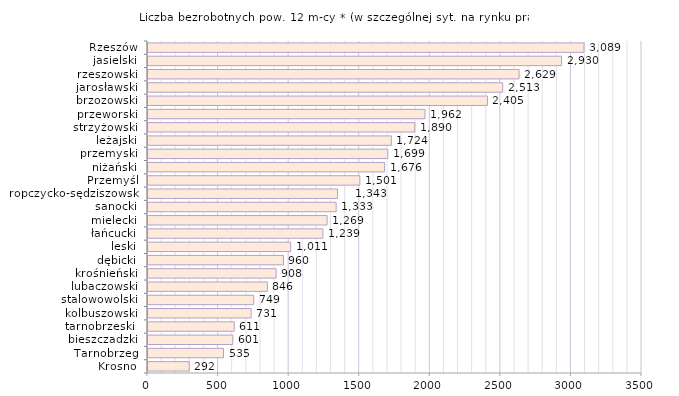
| Category | Liczba bezrobotnych powyżej 12 miesięcy* - w szczególnej sytuacji na rynku pracy |
|---|---|
| Krosno | 292 |
| Tarnobrzeg | 535 |
| bieszczadzki | 601 |
| tarnobrzeski  | 611 |
| kolbuszowski | 731 |
| stalowowolski | 749 |
| lubaczowski | 846 |
| krośnieński | 908 |
| dębicki | 960 |
| leski | 1011 |
| łańcucki | 1239 |
| mielecki | 1269 |
| sanocki | 1333 |
| ropczycko-sędziszowski | 1343 |
| Przemyśl | 1501 |
| niżański | 1676 |
| przemyski | 1699 |
| leżajski | 1724 |
| strzyżowski | 1890 |
| przeworski | 1962 |
| brzozowski | 2405 |
| jarosławski | 2513 |
| rzeszowski | 2629 |
| jasielski | 2930 |
| Rzeszów | 3089 |